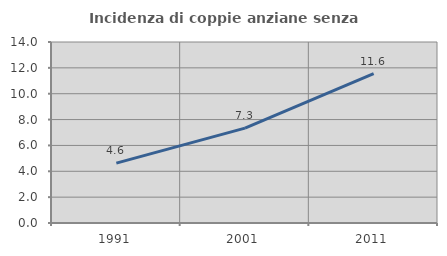
| Category | Incidenza di coppie anziane senza figli  |
|---|---|
| 1991.0 | 4.63 |
| 2001.0 | 7.334 |
| 2011.0 | 11.556 |